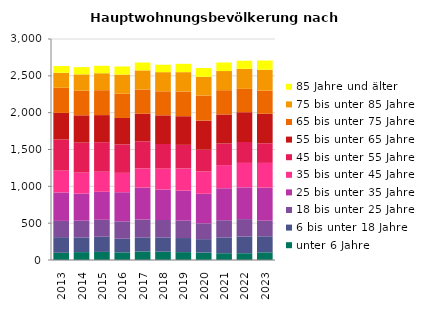
| Category | unter 6 Jahre | 6 bis unter 18 Jahre | 18 bis unter 25 Jahre | 25 bis unter 35 Jahre | 35 bis unter 45 Jahre | 45 bis unter 55 Jahre | 55 bis unter 65 Jahre | 65 bis unter 75 Jahre | 75 bis unter 85 Jahre | 85 Jahre und älter |
|---|---|---|---|---|---|---|---|---|---|---|
| 2013.0 | 98 | 212 | 221 | 386 | 296 | 422 | 362 | 341 | 203 | 92 |
| 2014.0 | 107 | 200 | 227 | 368 | 284 | 407 | 371 | 335 | 221 | 98 |
| 2015.0 | 110 | 206 | 230 | 380 | 272 | 401 | 368 | 338 | 230 | 101 |
| 2016.0 | 104 | 185 | 236 | 395 | 263 | 386 | 359 | 329 | 260 | 110 |
| 2017.0 | 116 | 191 | 242 | 434 | 260 | 368 | 374 | 329 | 260 | 107 |
| 2018.0 | 113 | 194 | 236 | 413 | 284 | 335 | 389 | 326 | 260 | 101 |
| 2019.0 | 107 | 191 | 236 | 407 | 302 | 320 | 389 | 335 | 263 | 113 |
| 2020.0 | 101 | 182 | 215 | 401 | 302 | 296 | 395 | 341 | 254 | 119 |
| 2021.0 | 92 | 215 | 233 | 434 | 314 | 293 | 395 | 329 | 260 | 116 |
| 2022.0 | 92 | 227 | 236 | 431 | 332 | 284 | 404 | 317 | 272 | 110 |
| 2023.0 | 104 | 218 | 212 | 449 | 335 | 266 | 401 | 314 | 284 | 125 |